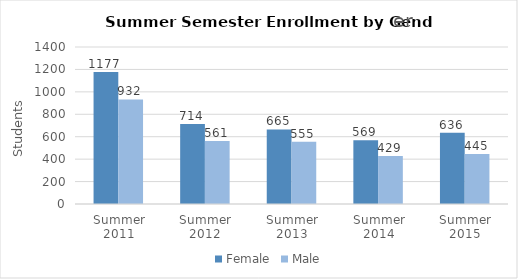
| Category | Female | Male |
|---|---|---|
| Summer 2011 | 1177 | 932 |
| Summer 2012 | 714 | 561 |
| Summer 2013 | 665 | 555 |
| Summer 2014 | 569 | 429 |
| Summer 2015 | 636 | 445 |